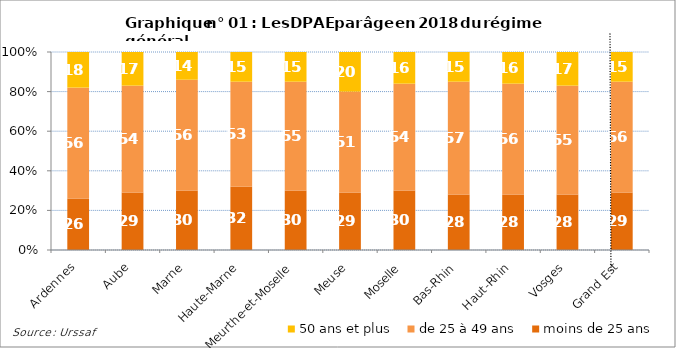
| Category | moins de 25 ans | de 25 à 49 ans | 50 ans et plus |
|---|---|---|---|
| Ardennes | 26 | 56 | 18 |
| Aube | 29 | 54 | 17 |
| Marne | 30 | 56 | 14 |
| Haute-Marne | 32 | 53 | 15 |
| Meurthe-et-Moselle | 30 | 55 | 15 |
| Meuse | 29 | 51 | 20 |
| Moselle | 30 | 54 | 16 |
| Bas-Rhin | 28 | 57 | 15 |
| Haut-Rhin | 28 | 56 | 16 |
| Vosges | 28 | 55 | 17 |
| Grand Est | 29 | 56 | 15 |